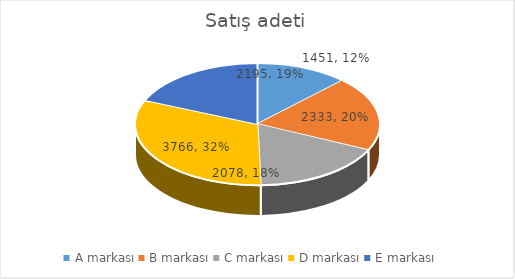
| Category | Satış adeti |
|---|---|
| A markası | 1451 |
| B markası | 2333 |
| C markası | 2078 |
| D markası | 3766 |
| E markası | 2195 |